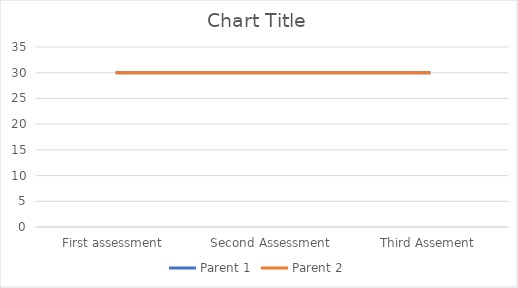
| Category | Parent 1 | Parent 2 |
|---|---|---|
| First assessment | 30 | 30 |
| Second Assessment | 30 | 30 |
| Third Assement | 30 | 30 |